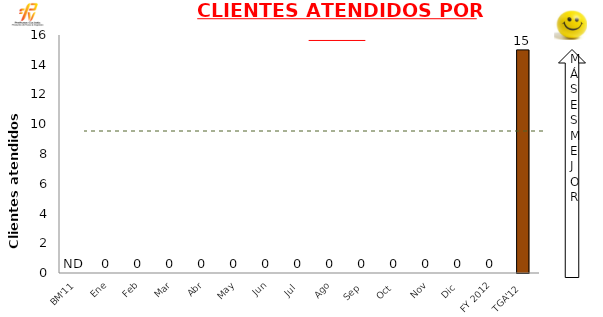
| Category | Mensual |
|---|---|
| BM'11 | 0 |
| Ene | 0 |
| Feb | 0 |
| Mar | 0 |
| Abr | 0 |
| May | 0 |
| Jun | 0 |
| Jul | 0 |
| Ago | 0 |
| Sep | 0 |
| Oct | 0 |
| Nov | 0 |
| Dic | 0 |
| FY 2012 | 0 |
| TGA'12 | 15 |